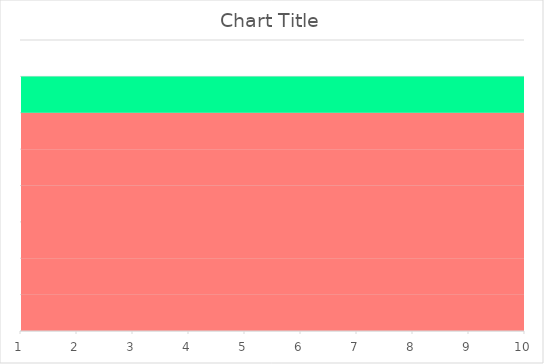
| Category | Natural ventilation | Positive input from loft | Positive input from outside | Balanced without heat recovery | Centralised whole house extract | Decentralised whole house extract | Balanced with heat recovery |
|---|---|---|---|---|---|---|---|
| 1.0 | 1 | 1 | 1 | 1 | 1 | 1 | 1 |
| 2.0 | 1 | 1 | 1 | 1 | 1 | 1 | 1 |
| 3.0 | 1 | 1 | 1 | 1 | 1 | 1 | 1 |
| 4.0 | 1 | 1 | 1 | 1 | 1 | 1 | 1 |
| 5.0 | 1 | 1 | 1 | 1 | 1 | 1 | 1 |
| 6.0 | 1 | 1 | 1 | 1 | 1 | 1 | 1 |
| 7.0 | 1 | 1 | 1 | 1 | 1 | 1 | 1 |
| 8.0 | 1 | 1 | 1 | 1 | 1 | 1 | 1 |
| 9.0 | 1 | 1 | 1 | 1 | 1 | 1 | 1 |
| 10.0 | 1 | 1 | 1 | 1 | 1 | 1 | 1 |